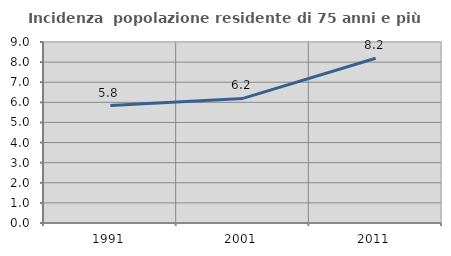
| Category | Incidenza  popolazione residente di 75 anni e più |
|---|---|
| 1991.0 | 5.842 |
| 2001.0 | 6.195 |
| 2011.0 | 8.189 |